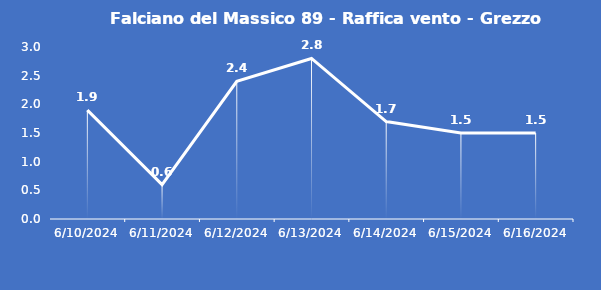
| Category | Falciano del Massico 89 - Raffica vento - Grezzo (m/s) |
|---|---|
| 6/10/24 | 1.9 |
| 6/11/24 | 0.6 |
| 6/12/24 | 2.4 |
| 6/13/24 | 2.8 |
| 6/14/24 | 1.7 |
| 6/15/24 | 1.5 |
| 6/16/24 | 1.5 |